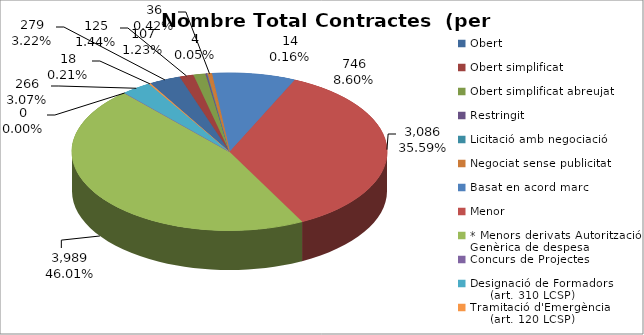
| Category | Nombre Total Contractes |
|---|---|
| Obert | 279 |
| Obert simplificat | 125 |
| Obert simplificat abreujat | 107 |
| Restringit | 14 |
| Licitació amb negociació | 4 |
| Negociat sense publicitat | 36 |
| Basat en acord marc | 746 |
| Menor | 3086 |
| * Menors derivats Autorització Genèrica de despesa | 3989 |
| Concurs de Projectes | 0 |
| Designació de Formadors
     (art. 310 LCSP) | 266 |
| Tramitació d'Emergència
     (art. 120 LCSP) | 18 |